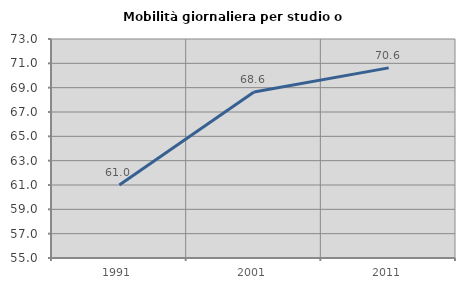
| Category | Mobilità giornaliera per studio o lavoro |
|---|---|
| 1991.0 | 60.997 |
| 2001.0 | 68.644 |
| 2011.0 | 70.626 |